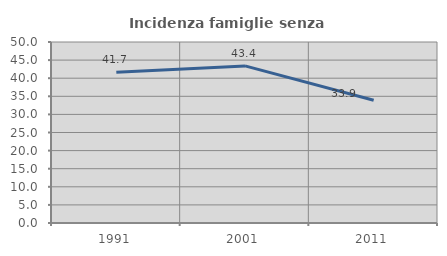
| Category | Incidenza famiglie senza nuclei |
|---|---|
| 1991.0 | 41.667 |
| 2001.0 | 43.396 |
| 2011.0 | 33.898 |